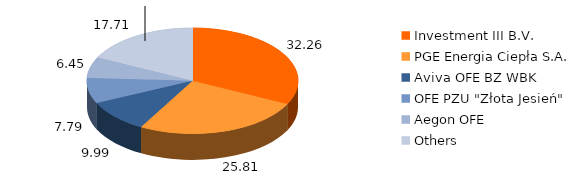
| Category | Series 2 | Series 3 | Series 1 | Series 0 |
|---|---|---|---|---|
| Investment III B.V.  | 32.263 | 32.263 | 4807132 | 4807132 |
| PGE Energia Ciepła S.A. | 25.806 | 25.806 | 3845041 | 3845041 |
| Aviva OFE BZ WBK | 9.993 | 9.993 | 1489000 | 1489000 |
| OFE PZU "Złota Jesień" | 7.785 | 7.785 | 1160000 | 1160000 |
| Aegon OFE | 6.448 | 6.448 | 960690 | 960690 |
| Others | 17.706 | 17.706 | 2638137 | 2638137 |